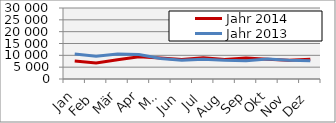
| Category | Jahr 2014 | Jahr 2013 |
|---|---|---|
| 0 | 7564.958 | 10590.916 |
| 1 | 6800.525 | 9663.531 |
| 2 | 8129.976 | 10609.424 |
| 3 | 9412.735 | 10386.103 |
| 4 | 8908.129 | 8679.438 |
| 5 | 8227.048 | 7877.886 |
| 6 | 8969.808 | 8396.598 |
| 7 | 8216.196 | 7932.954 |
| 8 | 8884.144 | 7713.615 |
| 9 | 8380.347 | 8473.737 |
| 10 | 7925.137 | 7923.623 |
| 11 | 8375.046 | 7671.17 |